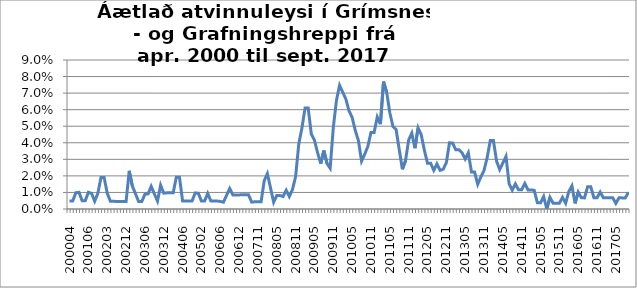
| Category | Series 0 |
|---|---|
| 200004 | 0.005 |
| 200005 | 0.005 |
| 200006 | 0.01 |
| 200007 | 0.01 |
| 200011 | 0.005 |
| 200012 | 0.005 |
| 200106 | 0.01 |
| 200107 | 0.009 |
| 200108 | 0.005 |
| 200112 | 0.009 |
| 200201 | 0.019 |
| 200202 | 0.019 |
| 200203 | 0.009 |
| 200204 | 0.005 |
| 200206 | 0.005 |
| 200207 | 0.004 |
| 200210 | 0.004 |
| 200211 | 0.004 |
| 200212 | 0.004 |
| 200301 | 0.023 |
| 200302 | 0.014 |
| 200303 | 0.009 |
| 200304 | 0.004 |
| 200305 | 0.004 |
| 200306 | 0.009 |
| 200307 | 0.009 |
| 200308 | 0.014 |
| 200309 | 0.009 |
| 200310 | 0.005 |
| 200311 | 0.014 |
| 200312 | 0.01 |
| 200401 | 0.01 |
| 200402 | 0.01 |
| 200403 | 0.01 |
| 200404 | 0.019 |
| 200405 | 0.019 |
| 200406 | 0.005 |
| 200409 | 0.005 |
| 200410 | 0.005 |
| 200411 | 0.005 |
| 200412 | 0.01 |
| 200501 | 0.01 |
| 200502 | 0.005 |
| 200503 | 0.005 |
| 200504 | 0.009 |
| 200512 | 0.005 |
| 200602 | 0.005 |
| 200603 | 0.005 |
| 200606 | 0.005 |
| 200607 | 0.004 |
| 200608 | 0.008 |
| 200609 | 0.012 |
| 200610 | 0.009 |
| 200611 | 0.009 |
| 200612 | 0.009 |
| 200701 | 0.009 |
| 200702 | 0.009 |
| 200703 | 0.009 |
| 200704 | 0.004 |
| 200710 | 0.004 |
| 200711 | 0.004 |
| 200712 | 0.004 |
| 200801 | 0.017 |
| 200802 | 0.021 |
| 200803 | 0.013 |
| 200804 | 0.004 |
| 200805 | 0.008 |
| 200806 | 0.008 |
| 200807 | 0.008 |
| 200808 | 0.011 |
| 200809 | 0.008 |
| 200810 | 0.012 |
| 200811 | 0.02 |
| 200812 | 0.039 |
| 200901 | 0.049 |
| 200902 | 0.061 |
| 200903 | 0.061 |
| 200904 | 0.045 |
| 200905 | 0.042 |
| 200906 | 0.034 |
| 200907 | 0.027 |
| 200908 | 0.035 |
| 200909 | 0.027 |
| 200910 | 0.025 |
| 200911 | 0.049 |
| 200912 | 0.066 |
| 201001 | 0.075 |
| 201002 | 0.071 |
| 201003 | 0.066 |
| 201004 | 0.059 |
| 201005 | 0.055 |
| 201006 | 0.047 |
| 201007 | 0.041 |
| 201008 | 0.029 |
| 201009 | 0.033 |
| 201010 | 0.038 |
| 201011 | 0.046 |
| 201012 | 0.046 |
| 201101 | 0.056 |
| 201102 | 0.051 |
| 201103 | 0.077 |
| 201104 | 0.071 |
| 201105 | 0.058 |
| 201106 | 0.05 |
| 201107 | 0.048 |
| 201108 | 0.036 |
| 201109 | 0.024 |
| 201110 | 0.029 |
| 201111 | 0.042 |
| 201112 | 0.046 |
| 201201 | 0.037 |
| 201202 | 0.049 |
| 201203 | 0.045 |
| 201204 | 0.036 |
| 201205 | 0.028 |
| 201206 | 0.028 |
| 201207 | 0.023 |
| 201208 | 0.027 |
| 201209 | 0.023 |
| 201210 | 0.024 |
| 201211 | 0.028 |
| 201212 | 0.04 |
| 201301 | 0.04 |
| 201302 | 0.036 |
| 201303 | 0.036 |
| 201304 | 0.034 |
| 201305 | 0.03 |
| 201306 | 0.034 |
| 201307 | 0.022 |
| 201308 | 0.022 |
| 201309 | 0.015 |
| 201310 | 0.019 |
| 201311 | 0.023 |
| 201312 | 0.031 |
| 201401 | 0.041 |
| 201402 | 0.041 |
| 201403 | 0.029 |
| 201404 | 0.024 |
| 201405 | 0.028 |
| 201406 | 0.032 |
| 201407 | 0.015 |
| 201408 | 0.011 |
| 201409 | 0.015 |
| 201410 | 0.012 |
| 201411 | 0.012 |
| 201412 | 0.015 |
| 201501 | 0.012 |
| 201502 | 0.012 |
| 201503 | 0.011 |
| 201504 | 0.004 |
| 201505 | 0.004 |
| 201506 | 0.007 |
| 201507 | 0 |
| 201508 | 0.007 |
| 201509 | 0.004 |
| 201510 | 0.003 |
| 201511 | 0.003 |
| 201512 | 0.007 |
| 201601 | 0.003 |
| 201602 | 0.01 |
| 201603 | 0.014 |
| 201604 | 0.003 |
| 201605 | 0.01 |
| 201606 | 0.007 |
| 201607 | 0.007 |
| 201608 | 0.013 |
| 201609 | 0.013 |
| 201610 | 0.007 |
| 201611 | 0.007 |
| 201612 | 0.01 |
| 201701 | 0.007 |
| 201702 | 0.007 |
| 201703 | 0.007 |
| 201704 | 0.007 |
| 201705 | 0.003 |
| 201706 | 0.007 |
| 201707 | 0.007 |
| 201708 | 0.007 |
| 201709 | 0.01 |